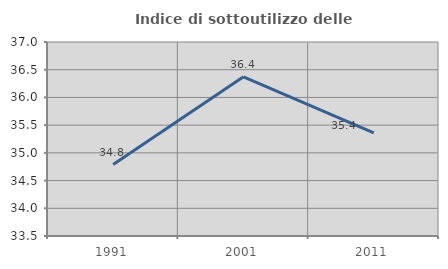
| Category | Indice di sottoutilizzo delle abitazioni  |
|---|---|
| 1991.0 | 34.79 |
| 2001.0 | 36.372 |
| 2011.0 | 35.361 |